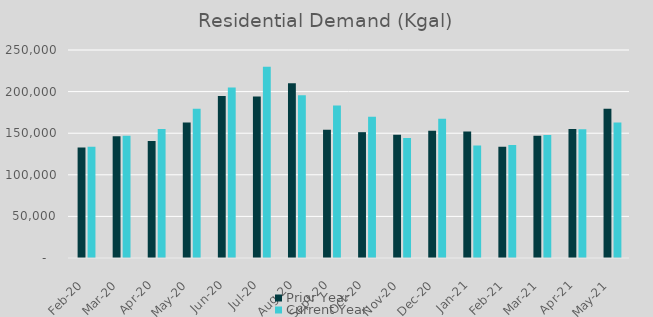
| Category | Prior Year | Current Year |
|---|---|---|
| 2020-02-01 | 132905 | 133616 |
| 2020-03-01 | 146212 | 146882 |
| 2020-04-01 | 140621 | 154955 |
| 2020-05-01 | 162790 | 179419 |
| 2020-06-01 | 194665 | 205078 |
| 2020-07-01 | 194086 | 229973 |
| 2020-08-01 | 209888 | 195761 |
| 2020-09-01 | 154070 | 183286 |
| 2020-10-01 | 151246 | 169712 |
| 2020-11-01 | 148146 | 144154 |
| 2020-12-01 | 152941 | 167244 |
| 2021-01-01 | 152023 | 135131 |
| 2021-02-01 | 133616 | 135791 |
| 2021-03-01 | 146882 | 147789 |
| 2021-04-01 | 154955 | 154879 |
| 2021-05-01 | 179419 | 162769 |